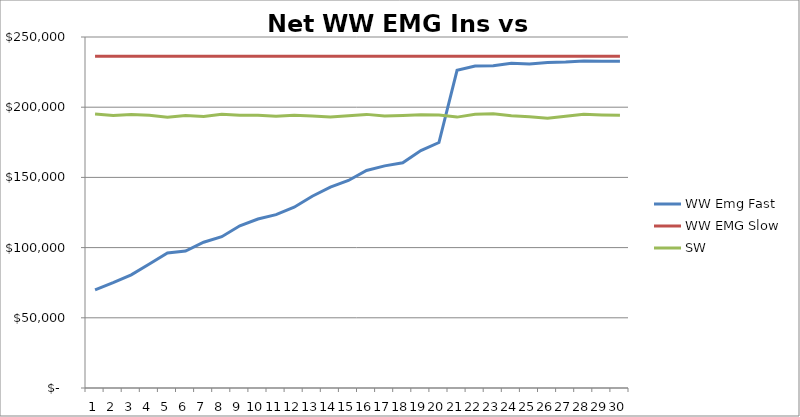
| Category | WW Emg Fast | WW EMG Slow | SW |
|---|---|---|---|
| 0 | 69953.713 | 236365.87 | 195175.851 |
| 1 | 75007.261 | 236365.87 | 194104.246 |
| 2 | 80578.317 | 236365.87 | 194744.599 |
| 3 | 88330.578 | 236365.87 | 194333.973 |
| 4 | 96166.905 | 236365.87 | 192877.631 |
| 5 | 97595.964 | 236365.87 | 194155.959 |
| 6 | 103840.791 | 236365.87 | 193416.288 |
| 7 | 107776.231 | 236365.87 | 194966.982 |
| 8 | 115563.904 | 236365.87 | 194221.382 |
| 9 | 120375.515 | 236365.87 | 194206.051 |
| 10 | 123453.294 | 236365.87 | 193618.043 |
| 11 | 128744.909 | 236365.87 | 194278.927 |
| 12 | 136569.669 | 236365.87 | 193671.167 |
| 13 | 143091.637 | 236365.87 | 192966.138 |
| 14 | 147817.525 | 236365.87 | 193993.938 |
| 15 | 154924.192 | 236365.87 | 194885.332 |
| 16 | 158197.902 | 236365.87 | 193671.929 |
| 17 | 160401.619 | 236365.87 | 194083.72 |
| 18 | 169134.934 | 236365.87 | 194542.159 |
| 19 | 174843.227 | 236365.87 | 194465.101 |
| 20 | 226230.272 | 236365.87 | 192943.034 |
| 21 | 229281.426 | 236365.87 | 194973.573 |
| 22 | 229563.584 | 236365.87 | 195259.768 |
| 23 | 231378.509 | 236365.87 | 193859.046 |
| 24 | 230770.357 | 236365.87 | 193158.349 |
| 25 | 231906.935 | 236365.87 | 192102.9 |
| 26 | 232260.959 | 236365.87 | 193631.378 |
| 27 | 232913.795 | 236365.87 | 194912.231 |
| 28 | 232735.851 | 236365.87 | 194443.482 |
| 29 | 232753.87 | 236365.87 | 194254.437 |